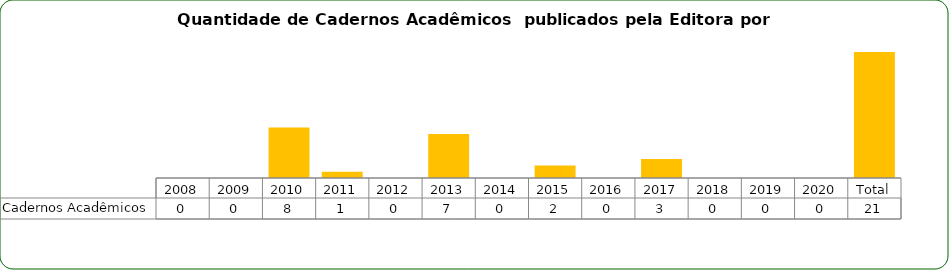
| Category | Cadernos Acadêmicos  |
|---|---|
| 2008 | 0 |
| 2009 | 0 |
| 2010 | 8 |
| 2011 | 1 |
| 2012 | 0 |
| 2013 | 7 |
| 2014 | 0 |
| 2015 | 2 |
| 2016 | 0 |
| 2017 | 3 |
| 2018 | 0 |
| 2019 | 0 |
| 2020 | 0 |
| Total | 21 |